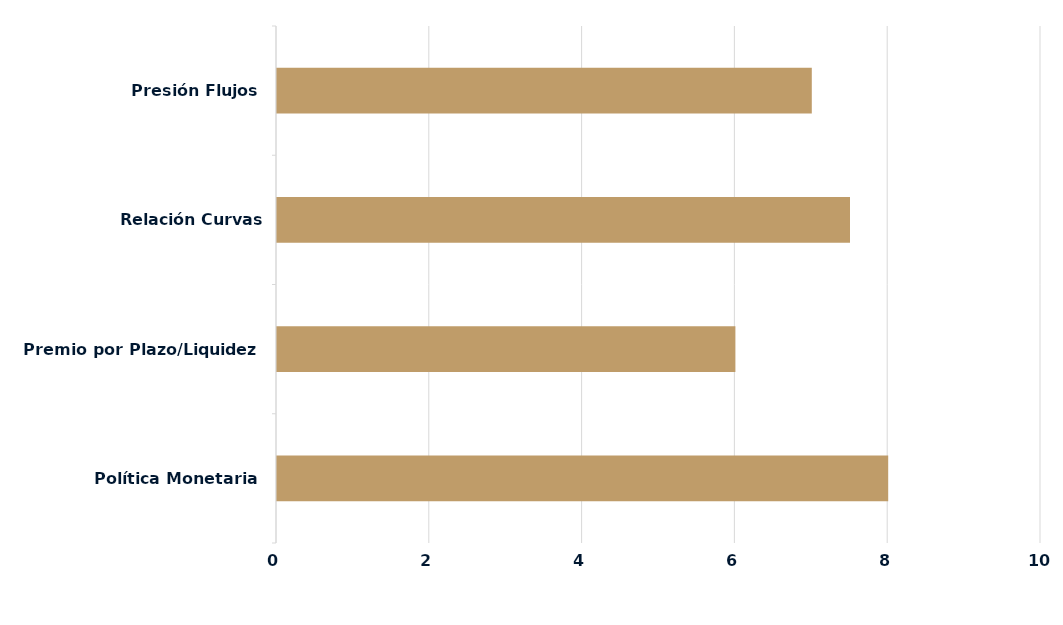
| Category | Series 0 |
|---|---|
| Política Monetaria | 8 |
| Premio por Plazo/Liquidez | 6 |
| Relación Curvas Internacionales | 7.5 |
| Presión Flujos | 7 |